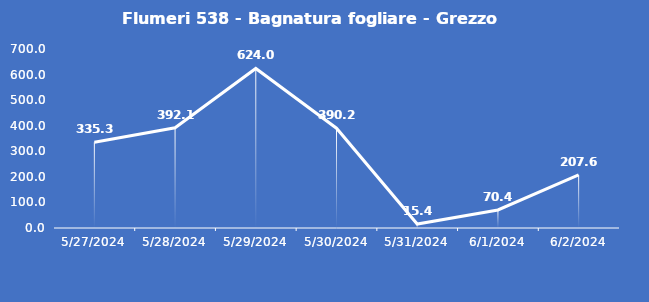
| Category | Flumeri 538 - Bagnatura fogliare - Grezzo (min) |
|---|---|
| 5/27/24 | 335.3 |
| 5/28/24 | 392.1 |
| 5/29/24 | 624 |
| 5/30/24 | 390.2 |
| 5/31/24 | 15.4 |
| 6/1/24 | 70.4 |
| 6/2/24 | 207.6 |